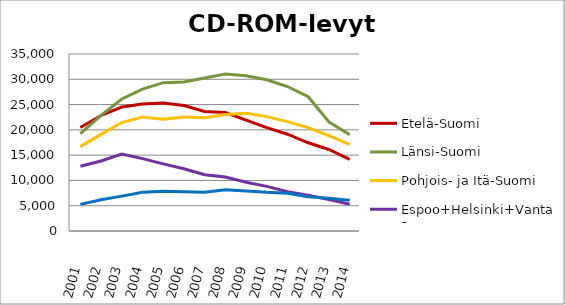
| Category | Etelä-Suomi | Länsi-Suomi | Pohjois- ja Itä-Suomi | Espoo+Helsinki+Vantaa | Muu Uusimaa |
|---|---|---|---|---|---|
| 2001.0 | 20468 | 19260 | 16678 | 12810 | 5269 |
| 2002.0 | 22843 | 22858 | 19108 | 13853 | 6174 |
| 2003.0 | 24509 | 26104 | 21443 | 15197 | 6896 |
| 2004.0 | 25134 | 28056 | 22547 | 14307 | 7653 |
| 2005.0 | 25322 | 29339 | 22105 | 13274 | 7851 |
| 2006.0 | 24812 | 29472 | 22553 | 12306 | 7745 |
| 2007.0 | 23640 | 30250 | 22409 | 11137 | 7683 |
| 2008.0 | 23422 | 31031 | 23021 | 10673 | 8149 |
| 2009.0 | 21930 | 30685 | 23296 | 9639 | 7924 |
| 2010.0 | 20451 | 29918 | 22621 | 8821 | 7653 |
| 2011.0 | 19136 | 28569 | 21628 | 7751 | 7483 |
| 2012.0 | 17444 | 26543 | 20441 | 7062 | 6754 |
| 2013.0 | 16113 | 21562 | 18854 | 6213 | 6493 |
| 2014.0 | 14145 | 19063 | 17146 | 5282 | 6085 |